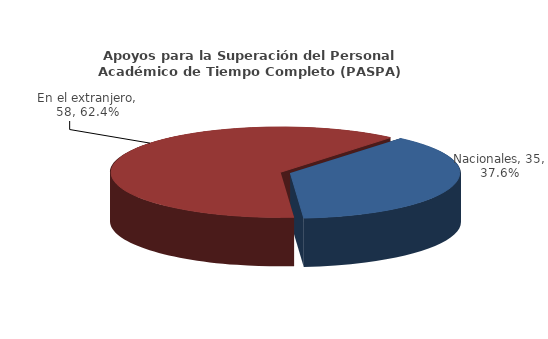
| Category | Series 0 |
|---|---|
| Nacionales | 35 |
| En el extranjero | 58 |